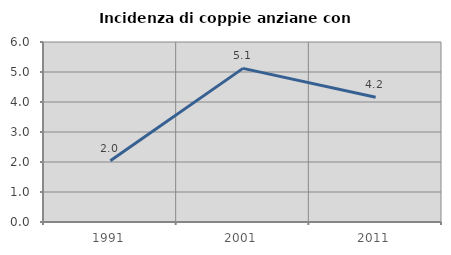
| Category | Incidenza di coppie anziane con figli |
|---|---|
| 1991.0 | 2.045 |
| 2001.0 | 5.121 |
| 2011.0 | 4.158 |